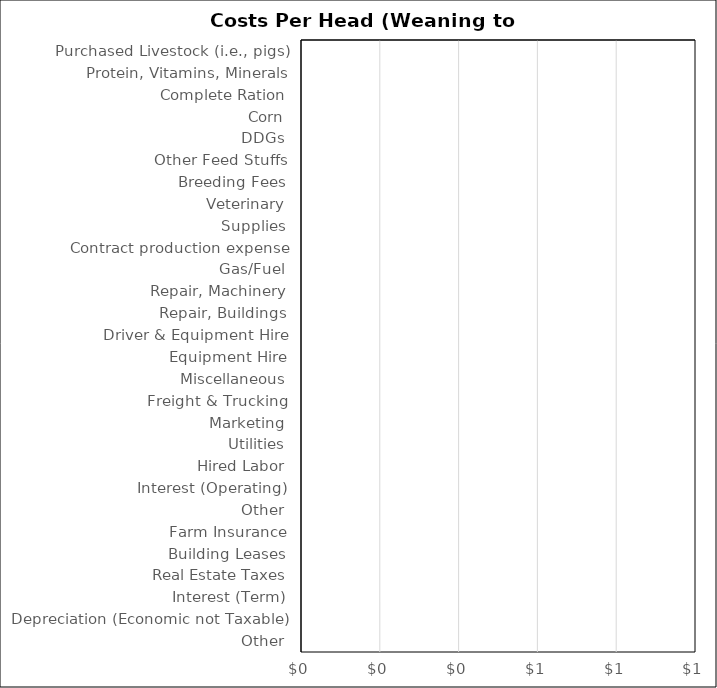
| Category | Beef Finishing |
|---|---|
| Purchased Livestock (i.e., pigs) | 0 |
| Protein, Vitamins, Minerals | 0 |
| Complete Ration | 0 |
| Corn | 0 |
| DDGs | 0 |
| Other Feed Stuffs | 0 |
| Breeding Fees | 0 |
| Veterinary | 0 |
| Supplies | 0 |
| Contract production expense | 0 |
| Gas/Fuel | 0 |
| Repair, Machinery | 0 |
| Repair, Buildings | 0 |
| Driver & Equipment Hire | 0 |
| Equipment Hire | 0 |
| Miscellaneous | 0 |
| Freight & Trucking | 0 |
| Marketing | 0 |
| Utilities | 0 |
| Hired Labor | 0 |
| Interest (Operating) | 0 |
| Other | 0 |
| Farm Insurance | 0 |
| Building Leases | 0 |
| Real Estate Taxes | 0 |
| Interest (Term) | 0 |
| Depreciation (Economic not Taxable) | 0 |
| Other | 0 |